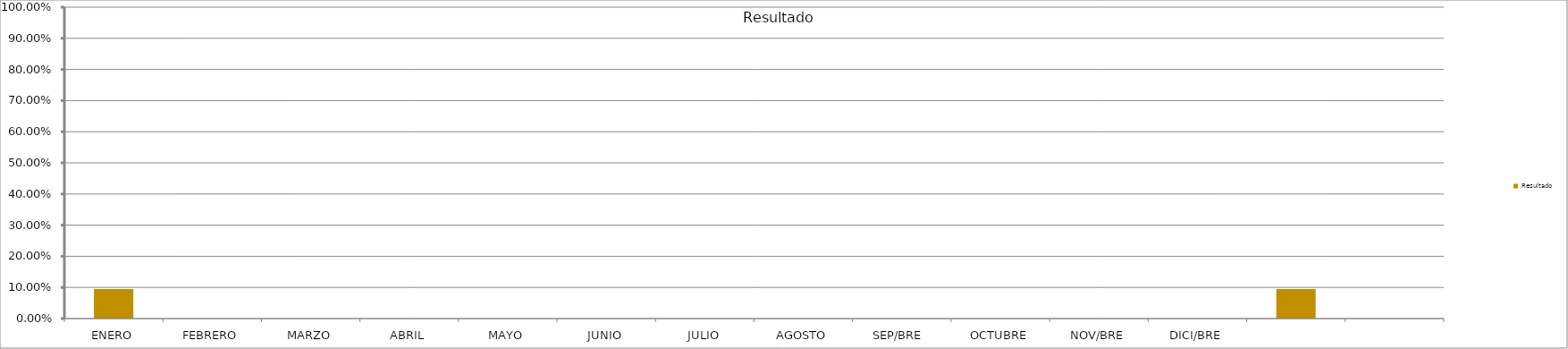
| Category | Resultado  |
|---|---|
| ENERO | 0.095 |
| FEBRERO | 0 |
| MARZO | 0 |
| ABRIL | 0 |
| MAYO | 0 |
| JUNIO | 0 |
| JULIO | 0 |
| AGOSTO | 0 |
| SEP/BRE  | 0 |
| OCTUBRE | 0 |
| NOV/BRE | 0 |
| DICI/BRE | 0 |